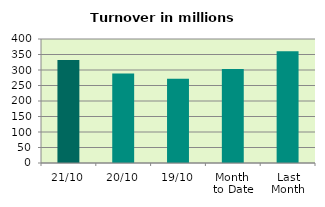
| Category | Series 0 |
|---|---|
| 21/10 | 332.227 |
| 20/10 | 288.45 |
| 19/10 | 271.572 |
| Month 
to Date | 303.342 |
| Last
Month | 360.198 |